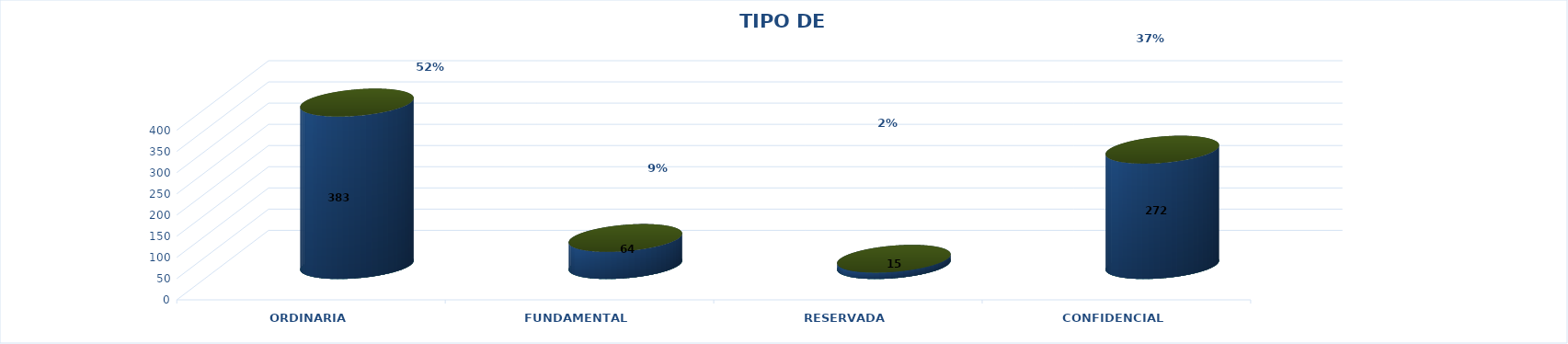
| Category | Series 0 | Series 2 | Series 1 | Series 3 | Series 4 |
|---|---|---|---|---|---|
| ORDINARIA |  |  |  | 383 | 0.522 |
| FUNDAMENTAL |  |  |  | 64 | 0.087 |
| RESERVADA |  |  |  | 15 | 0.02 |
| CONFIDENCIAL |  |  |  | 272 | 0.371 |